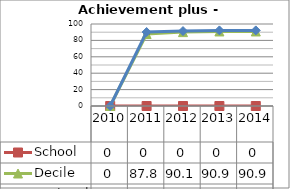
| Category | School  | Decile | National |
|---|---|---|---|
| 2010.0 | 0 | 0 | 0 |
| 2011.0 | 0 | 87.8 | 90.2 |
| 2012.0 | 0 | 90.1 | 91.4 |
| 2013.0 | 0 | 90.9 | 92.2 |
| 2014.0 | 0 | 90.9 | 92.2 |